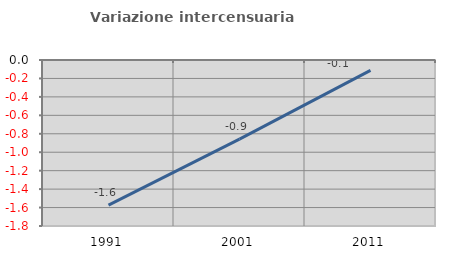
| Category | Variazione intercensuaria annua |
|---|---|
| 1991.0 | -1.574 |
| 2001.0 | -0.858 |
| 2011.0 | -0.113 |